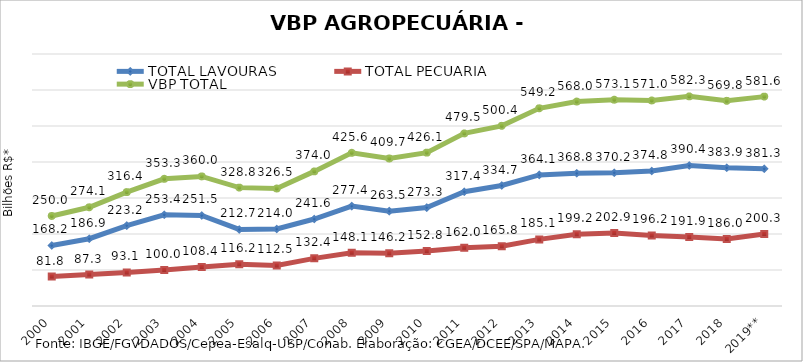
| Category | TOTAL LAVOURAS | TOTAL PECUÁRIA | VBP TOTAL |
|---|---|---|---|
| 2000 | 168.244 | 81.781 | 250.025 |
| 2001 | 186.887 | 87.25 | 274.138 |
| 2002 | 223.244 | 93.14 | 316.384 |
| 2003 | 253.38 | 99.97 | 353.35 |
| 2004 | 251.525 | 108.439 | 359.963 |
| 2005 | 212.653 | 116.164 | 328.817 |
| 2006 | 213.952 | 112.507 | 326.458 |
| 2007 | 241.62 | 132.358 | 373.977 |
| 2008 | 277.439 | 148.14 | 425.579 |
| 2009 | 263.53 | 146.213 | 409.743 |
| 2010 | 273.31 | 152.764 | 426.074 |
| 2011 | 317.416 | 162.044 | 479.46 |
| 2012 | 334.676 | 165.761 | 500.438 |
| 2013 | 364.13 | 185.052 | 549.182 |
| 2014 | 368.815 | 199.169 | 567.984 |
| 2015 | 370.153 | 202.899 | 573.052 |
| 2016 | 374.834 | 196.152 | 570.986 |
| 2017 | 390.407 | 191.938 | 582.345 |
| 2018 | 383.876 | 185.966 | 569.842 |
| 2019** | 381.31 | 200.26 | 581.57 |